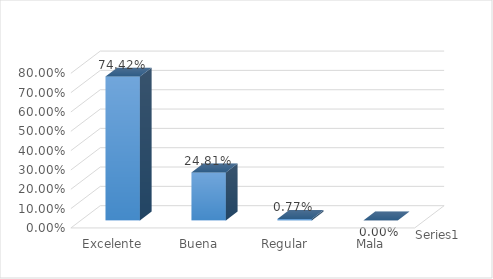
| Category | Series 0 |
|---|---|
| Excelente | 0.744 |
| Buena | 0.248 |
| Regular | 0.008 |
| Mala | 0 |